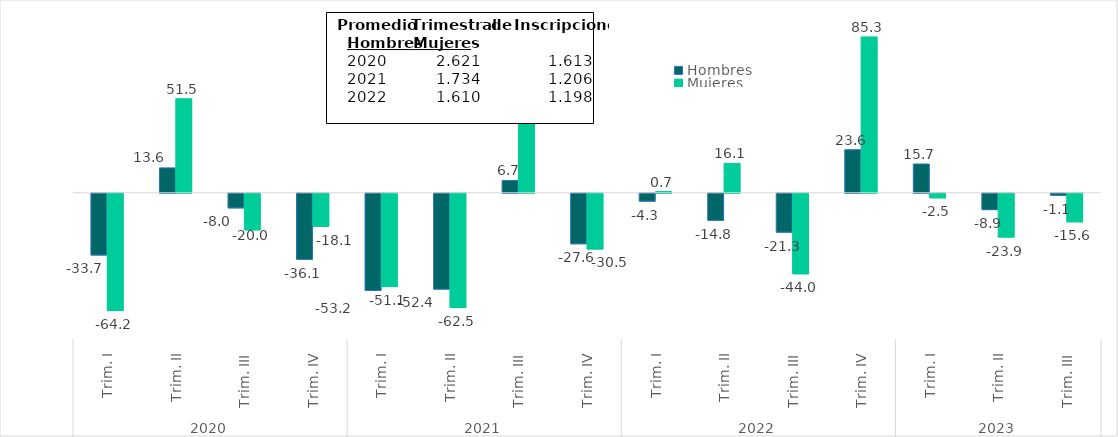
| Category | Hombres | Mujeres |
|---|---|---|
| 0 | -33.708 | -64.177 |
| 1 | 13.61 | 51.452 |
| 2 | -7.975 | -20 |
| 3 | -36.134 | -18.054 |
| 4 | -53.176 | -51.058 |
| 5 | -52.431 | -62.511 |
| 6 | 6.731 | 73.926 |
| 7 | -27.596 | -30.472 |
| 8 | -4.295 | 0.655 |
| 9 | -14.763 | 16.078 |
| 10 | -21.261 | -44.048 |
| 11 | 23.566 | 85.288 |
| 12 | 15.748 | -2.474 |
| 13 | -8.934 | -23.924 |
| 14 | -1.055 | -15.603 |